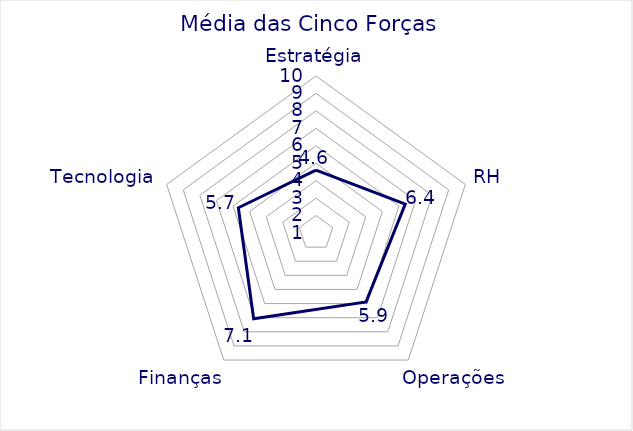
| Category | Média das 5 Forças |
|---|---|
| Estratégia | 4.6 |
| RH | 6.38 |
| Operações | 5.88 |
| Finanças | 7.08 |
| Tecnologia | 5.68 |